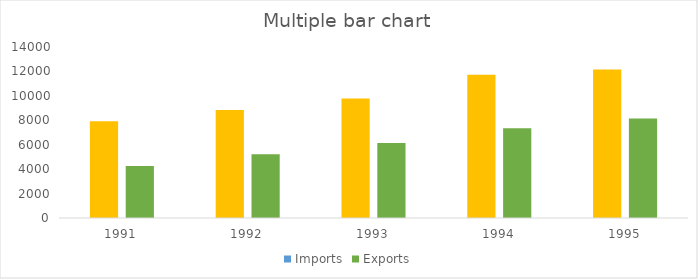
| Category | Imports | Exports |
|---|---|---|
| 1991.0 | 7930 | 4260 |
| 1992.0 | 8850 | 5225 |
| 1993.0 | 9780 | 6150 |
| 1994.0 | 11720 | 7340 |
| 1995.0 | 12150 | 8145 |